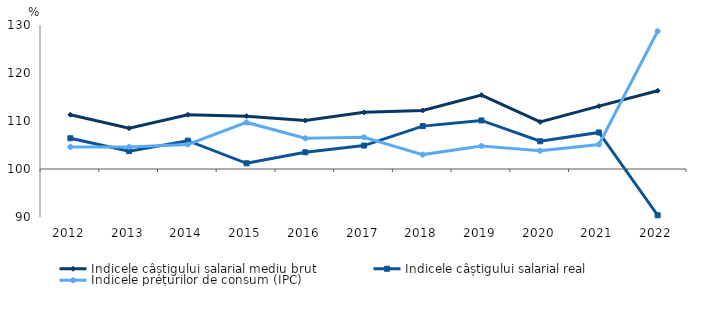
| Category | Indicele câștigului salarial mediu brut | Indicele câștigului salarial real | Indicele prețurilor de consum (IPC) |
|---|---|---|---|
| 2012.0 | 111.3 | 106.405 | 104.6 |
| 2013.0 | 108.5 | 103.728 | 104.6 |
| 2014.0 | 111.3 | 105.899 | 105.1 |
| 2015.0 | 111 | 101.185 | 109.7 |
| 2016.0 | 110.1 | 103.477 | 106.4 |
| 2017.0 | 111.8 | 104.878 | 106.6 |
| 2018.0 | 112.2 | 108.932 | 103 |
| 2019.0 | 115.4 | 110.115 | 104.8 |
| 2020.0 | 109.8 | 105.78 | 103.8 |
| 2021.0 | 113.1 | 107.612 | 105.1 |
| 2022.0 | 116.3 | 90.365 | 128.7 |